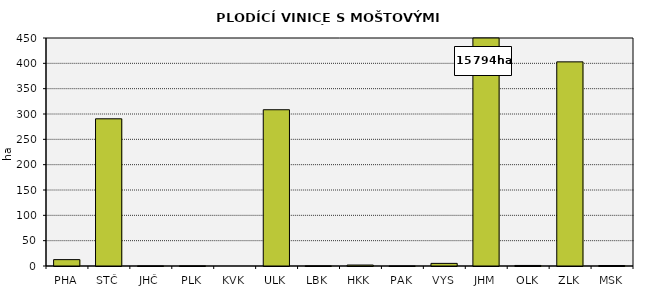
| Category | Series 0 |
|---|---|
| PHA | 12.564 |
| STČ | 290.51 |
| JHČ | 0.135 |
| PLK | 0.26 |
| KVK | 0 |
| ULK | 308.405 |
| LBK | 0.25 |
| HKK | 1.888 |
| PAK | 0.055 |
| VYS | 5.168 |
| JHM | 15794.351 |
| OLK | 1.067 |
| ZLK | 402.886 |
| MSK | 0.974 |